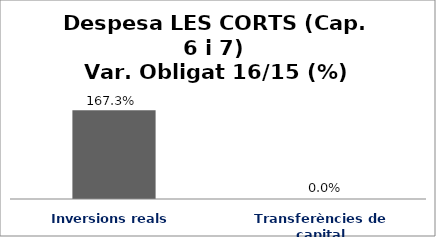
| Category | Series 0 |
|---|---|
| Inversions reals | 1.673 |
| Transferències de capital | 0 |